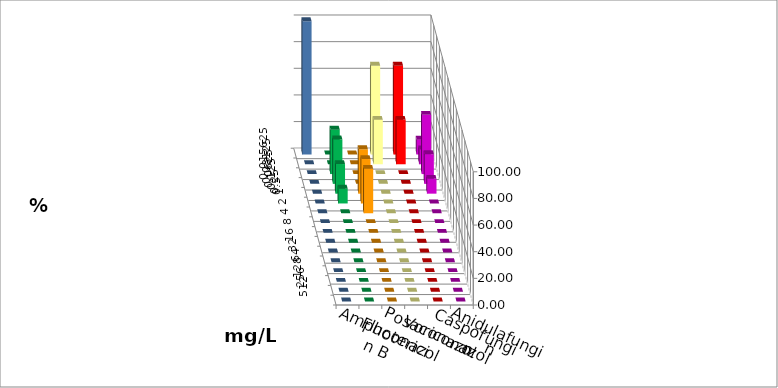
| Category | Amphotericin B | Fluconazol | Posaconazol | Voriconazol | Caspofungin | Anidulafungin |
|---|---|---|---|---|---|---|
| 0.015625 | 0 | 0 | 66.667 | 66.667 | 11.111 | 100 |
| 0.03125 | 0 | 0 | 33.333 | 33.333 | 11.111 | 0 |
| 0.0625 | 33.333 | 0 | 0 | 0 | 44.444 | 0 |
| 0.125 | 33.333 | 0 | 0 | 0 | 22.222 | 0 |
| 0.25 | 22.222 | 33.333 | 0 | 0 | 11.111 | 0 |
| 0.5 | 11.111 | 33.333 | 0 | 0 | 0 | 0 |
| 1.0 | 0 | 33.333 | 0 | 0 | 0 | 0 |
| 2.0 | 0 | 0 | 0 | 0 | 0 | 0 |
| 4.0 | 0 | 0 | 0 | 0 | 0 | 0 |
| 8.0 | 0 | 0 | 0 | 0 | 0 | 0 |
| 16.0 | 0 | 0 | 0 | 0 | 0 | 0 |
| 32.0 | 0 | 0 | 0 | 0 | 0 | 0 |
| 64.0 | 0 | 0 | 0 | 0 | 0 | 0 |
| 128.0 | 0 | 0 | 0 | 0 | 0 | 0 |
| 256.0 | 0 | 0 | 0 | 0 | 0 | 0 |
| 512.0 | 0 | 0 | 0 | 0 | 0 | 0 |